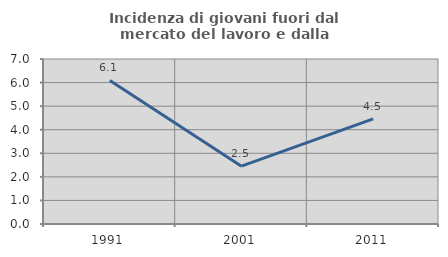
| Category | Incidenza di giovani fuori dal mercato del lavoro e dalla formazione  |
|---|---|
| 1991.0 | 6.091 |
| 2001.0 | 2.454 |
| 2011.0 | 4.459 |